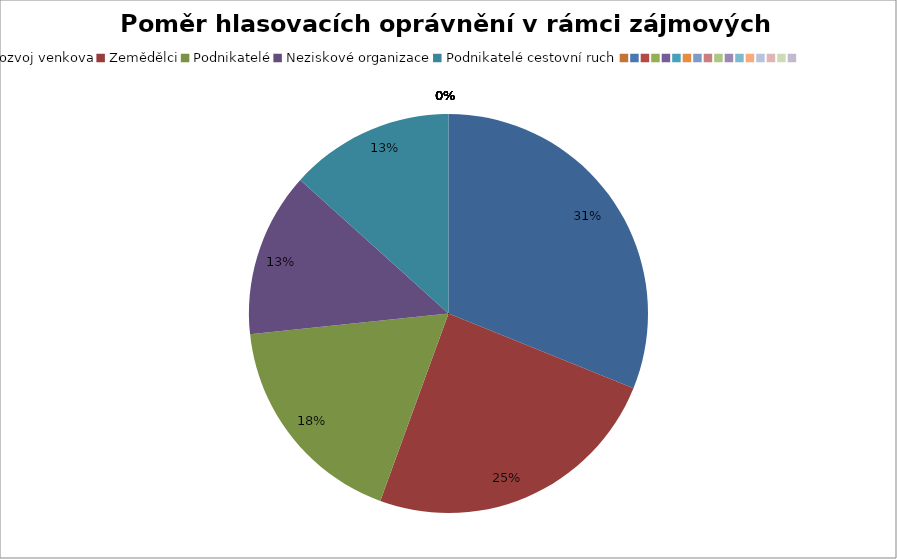
| Category | Series 0 |
|---|---|
| Rozvoj venkova | 0.311 |
| Zemědělci | 0.244 |
| Podnikatelé | 0.178 |
| Neziskové organizace | 0.133 |
| Podnikatelé cestovní ruch | 0.133 |